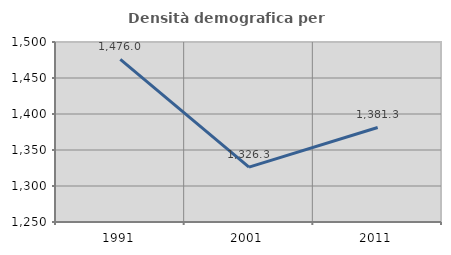
| Category | Densità demografica |
|---|---|
| 1991.0 | 1475.956 |
| 2001.0 | 1326.284 |
| 2011.0 | 1381.325 |